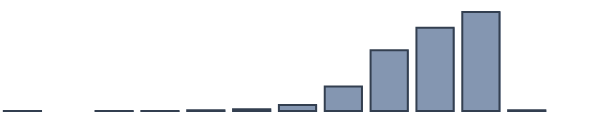
| Category | Series 0 |
|---|---|
| 0 | 0.043 |
| 1 | 0 |
| 2 | 0.043 |
| 3 | 0.043 |
| 4 | 0.261 |
| 5 | 0.609 |
| 6 | 2.174 |
| 7 | 8.87 |
| 8 | 21.913 |
| 9 | 30.043 |
| 10 | 35.696 |
| 11 | 0.304 |
| 12 | 0 |